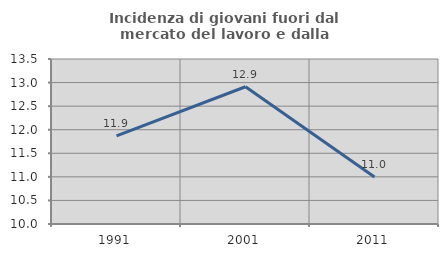
| Category | Incidenza di giovani fuori dal mercato del lavoro e dalla formazione  |
|---|---|
| 1991.0 | 11.869 |
| 2001.0 | 12.911 |
| 2011.0 | 10.996 |